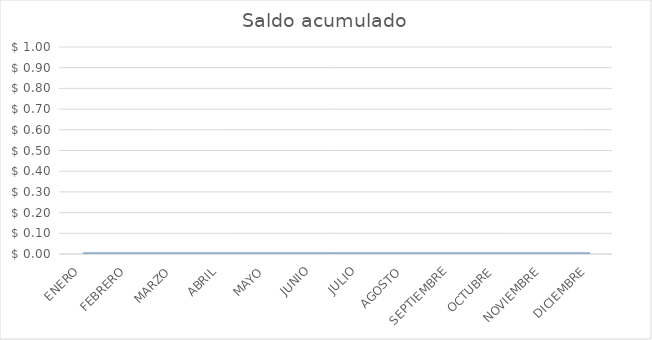
| Category | Saldo acumulado |
|---|---|
| ENERO | 0 |
| FEBRERO | 0 |
| MARZO | 0 |
| ABRIL | 0 |
| MAYO | 0 |
| JUNIO | 0 |
| JULIO | 0 |
| AGOSTO | 0 |
| SEPTIEMBRE | 0 |
| OCTUBRE | 0 |
| NOVIEMBRE | 0 |
| DICIEMBRE | 0 |